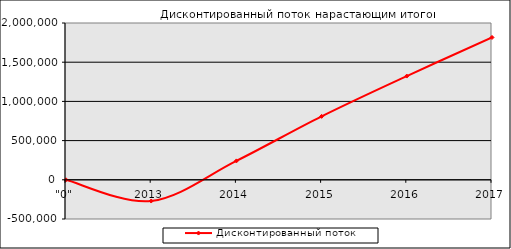
| Category | Дисконтированный поток нарастающим итогом |
|---|---|
| "0" | 0 |
| 2013 | -270970.678 |
| 2014 | 241108.062 |
| 2015 | 809072.097 |
| 2016 | 1323135.656 |
| 2017 | 1815519.877 |